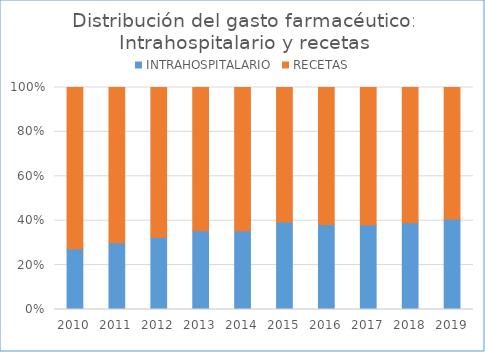
| Category | INTRAHOSPITALARIO | RECETAS |
|---|---|---|
| 2010.0 | 150245 | 399220 |
| 2011.0 | 155484 | 362195 |
| 2012.0 | 153360 | 318430 |
| 2013.0 | 162959 | 295951 |
| 2014.0 | 165204 | 301004 |
| 2015.0 | 199951 | 307105 |
| 2016.0 | 204050 | 328217 |
| 2017.0 | 205284 | 332790 |
| 2018.0 | 218623 | 341612 |
| 2019.0 | 238465 | 346671 |